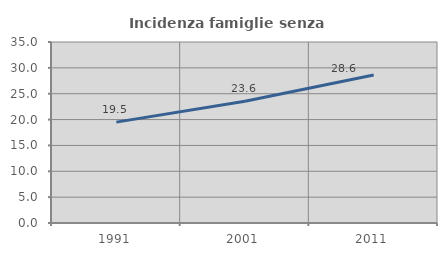
| Category | Incidenza famiglie senza nuclei |
|---|---|
| 1991.0 | 19.509 |
| 2001.0 | 23.556 |
| 2011.0 | 28.614 |